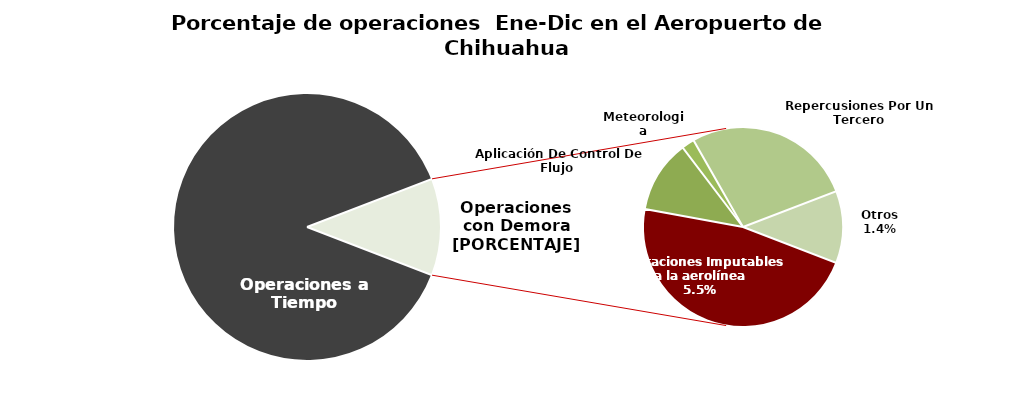
| Category | Series 0 |
|---|---|
| Operaciones a Tiempo | 7233 |
| Operaciones Imputables a la aerolínea | 451 |
| Aplicación De Control De Flujo  | 113 |
| Meteorologia | 20 |
| Repercusiones Por Un Tercero | 263 |
| Otros | 112 |